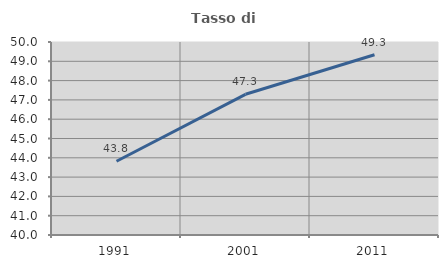
| Category | Tasso di occupazione   |
|---|---|
| 1991.0 | 43.819 |
| 2001.0 | 47.29 |
| 2011.0 | 49.339 |